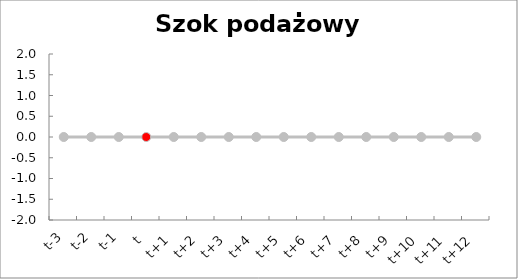
| Category | Series 1 | Szok podażowy v |
|---|---|---|
| t-3 | 0 | 0 |
| t-2 | 0 | 0 |
| t-1 | 0 | 0 |
| t | 0 | 0 |
| t+1 | 0 | 0 |
| t+2 | 0 | 0 |
| t+3 | 0 | 0 |
| t+4 | 0 | 0 |
| t+5 | 0 | 0 |
| t+6 | 0 | 0 |
| t+7 | 0 | 0 |
| t+8 | 0 | 0 |
| t+9 | 0 | 0 |
| t+10 | 0 | 0 |
| t+11 | 0 | 0 |
| t+12 | 0 | 0 |